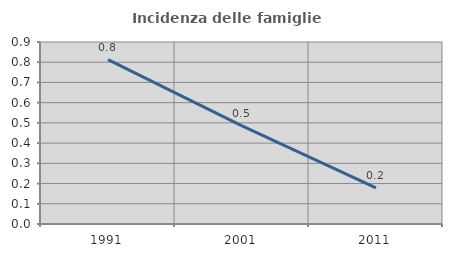
| Category | Incidenza delle famiglie numerose |
|---|---|
| 1991.0 | 0.813 |
| 2001.0 | 0.485 |
| 2011.0 | 0.178 |